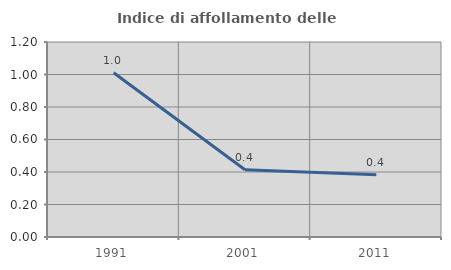
| Category | Indice di affollamento delle abitazioni  |
|---|---|
| 1991.0 | 1.011 |
| 2001.0 | 0.414 |
| 2011.0 | 0.382 |